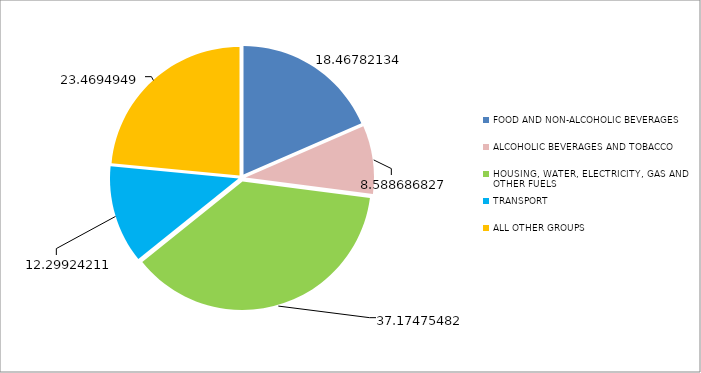
| Category | Series 0 |
|---|---|
| FOOD AND NON-ALCOHOLIC BEVERAGES  | 18.468 |
| ALCOHOLIC BEVERAGES AND TOBACCO | 8.589 |
| HOUSING, WATER, ELECTRICITY, GAS AND OTHER FUELS | 37.175 |
| TRANSPORT | 12.299 |
| ALL OTHER GROUPS | 23.469 |